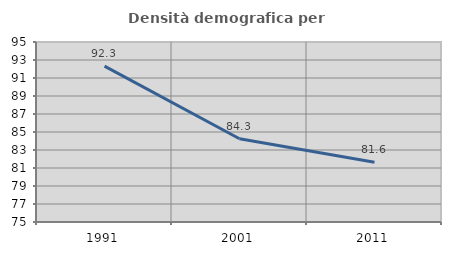
| Category | Densità demografica |
|---|---|
| 1991.0 | 92.326 |
| 2001.0 | 84.253 |
| 2011.0 | 81.648 |